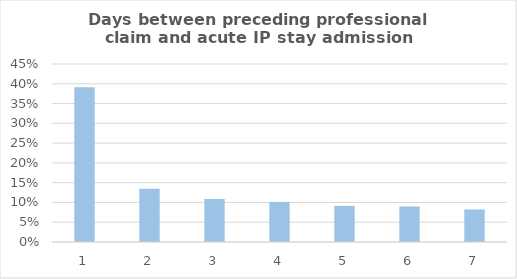
| Category | Number of days between preceeding professional claim and Acute IP admission |
|---|---|
| 1.0 | 0.391 |
| 2.0 | 0.135 |
| 3.0 | 0.109 |
| 4.0 | 0.101 |
| 5.0 | 0.091 |
| 6.0 | 0.09 |
| 7.0 | 0.082 |